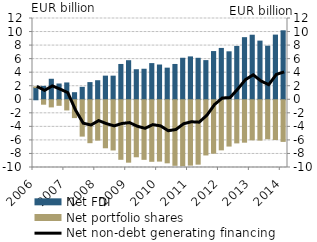
| Category | Net FDI | Net portfolio shares |
|---|---|---|
| 2006.0 | 1.794 | 0.12 |
| 2006.0 | 1.974 | -0.655 |
| 2006.0 | 3.027 | -1.052 |
| 2006.0 | 2.327 | -0.819 |
| 2007.0 | 2.485 | -1.502 |
| 2007.0 | 1.045 | -2.631 |
| 2007.0 | 1.836 | -5.366 |
| 2007.0 | 2.537 | -6.338 |
| 2008.0 | 2.813 | -5.96 |
| 2008.0 | 3.491 | -7.088 |
| 2008.0 | 3.487 | -7.411 |
| 2008.0 | 5.213 | -8.79 |
| 2009.0 | 5.768 | -9.214 |
| 2009.0 | 4.436 | -8.417 |
| 2009.0 | 4.508 | -8.796 |
| 2009.0 | 5.342 | -9.085 |
| 2010.0 | 5.133 | -9.055 |
| 2010.0 | 4.669 | -9.31 |
| 2010.0 | 5.214 | -9.678 |
| 2010.0 | 6.129 | -9.737 |
| 2011.0 | 6.33 | -9.651 |
| 2011.0 | 6.124 | -9.505 |
| 2011.0 | 5.784 | -8.148 |
| 2011.0 | 7.119 | -7.887 |
| 2012.0 | 7.582 | -7.393 |
| 2012.0 | 7.082 | -6.834 |
| 2012.0 | 7.878 | -6.368 |
| 2012.0 | 9.17 | -6.264 |
| 2013.0 | 9.53 | -5.918 |
| 2013.0 | 8.661 | -5.957 |
| 2013.0 | 7.91 | -5.751 |
| 2013.0 | 9.549 | -5.871 |
| 2014.0 | 10.185 | -6.147 |